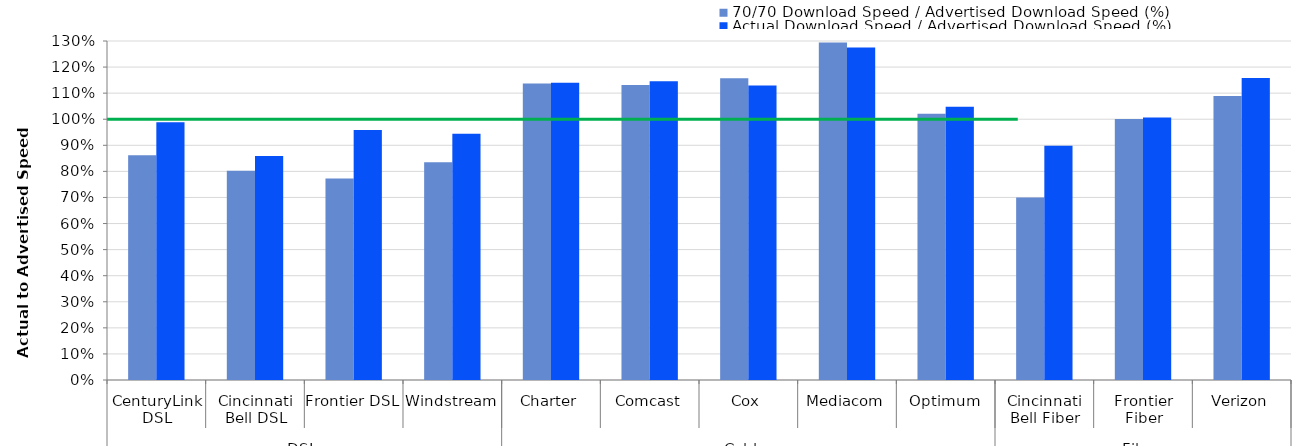
| Category | 70/70 Download Speed / Advertised Download Speed (%) | Actual Download Speed / Advertised Download Speed (%) |
|---|---|---|
| 0 | 0.861 | 0.988 |
| 1 | 0.803 | 0.859 |
| 2 | 0.772 | 0.959 |
| 3 | 0.835 | 0.944 |
| 4 | 1.137 | 1.14 |
| 5 | 1.132 | 1.145 |
| 6 | 1.157 | 1.129 |
| 7 | 1.294 | 1.275 |
| 8 | 1.021 | 1.048 |
| 9 | 0.7 | 0.898 |
| 10 | 1.001 | 1.007 |
| 11 | 1.089 | 1.158 |